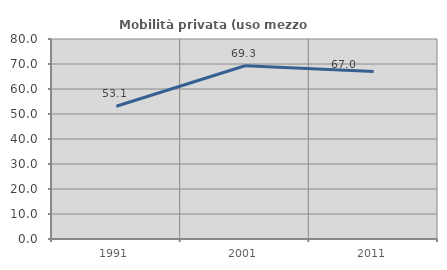
| Category | Mobilità privata (uso mezzo privato) |
|---|---|
| 1991.0 | 53.101 |
| 2001.0 | 69.317 |
| 2011.0 | 66.96 |